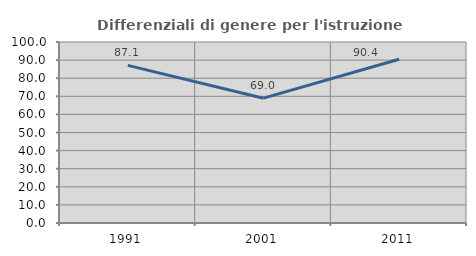
| Category | Differenziali di genere per l'istruzione superiore |
|---|---|
| 1991.0 | 87.095 |
| 2001.0 | 68.966 |
| 2011.0 | 90.433 |